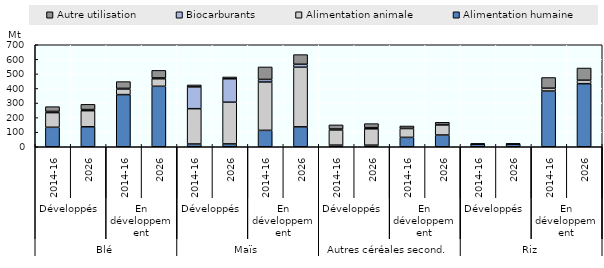
| Category | Alimentation humaine | Alimentation animale | Biocarburants | Autre utilisation |
|---|---|---|---|---|
| 0 | 133.626 | 100.526 | 8.369 | 32.676 |
| 1 | 136.951 | 110.55 | 7.688 | 35.879 |
| 2 | 357.899 | 38.023 | 4.741 | 46.529 |
| 3 | 414.932 | 51.774 | 5.629 | 51.879 |
| 4 | 18.961 | 242.279 | 149.748 | 13.252 |
| 5 | 19.605 | 286.212 | 160.536 | 12.613 |
| 6 | 112.502 | 331.795 | 17.781 | 85.728 |
| 7 | 136.696 | 409.166 | 20.283 | 66.278 |
| 8 | 11.078 | 104.087 | 6.604 | 28.337 |
| 9 | 10.939 | 112.186 | 8.051 | 27.469 |
| 10 | 64.411 | 60.967 | 1.212 | 15.846 |
| 11 | 80.559 | 69.787 | 1.892 | 15.572 |
| 12 | 17.392 | 1.212 | 0 | 0.535 |
| 13 | 17.49 | 1.314 | 0 | 0.523 |
| 14 | 382.462 | 19.388 | 0 | 73.297 |
| 15 | 432.783 | 23.836 | 0 | 83.796 |